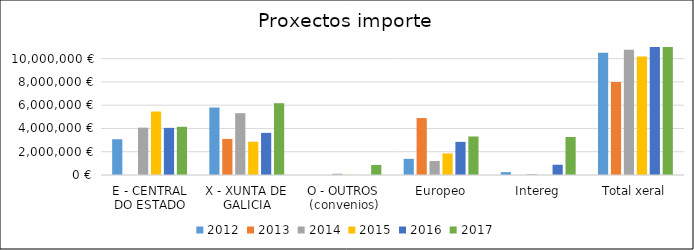
| Category | 2012 | 2013 | 2014 | 2015 | 2016 | 2017 |
|---|---|---|---|---|---|---|
| E - CENTRAL DO ESTADO | 3072197 | 0 | 4069609.34 | 5456349.24 | 4049876 | 4140299 |
| X - XUNTA DE GALICIA | 5797841.07 | 3097800 | 5312000 | 2860000 | 3619814.03 | 6170452 |
| O - OUTROS (convenios) | 0 | 0 | 108000 | 19954.57 | 0 | 860997 |
| Europeo | 1388722.22 | 4893072.39 | 1201045.6 | 1855568.5 | 2848255 | 3310824 |
| Intereg | 244400 | 0 | 72020 | 0 | 881250 | 3268859 |
| Total xeral | 10503160.29 | 7990872.39 | 10762674.94 | 10191872.31 | 11399195.03 | 17751431 |